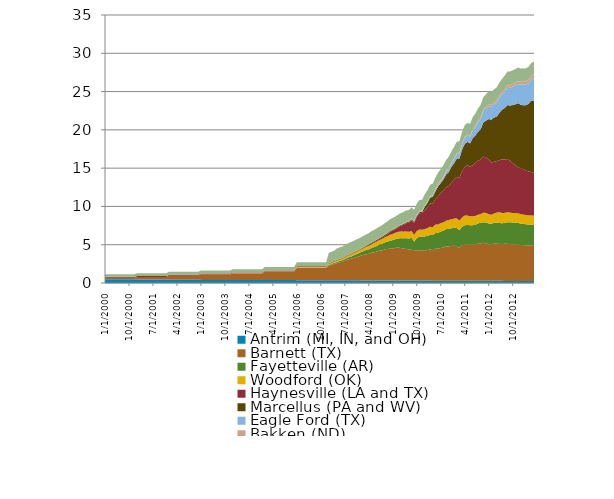
| Category | Antrim (MI, IN, and OH) | Barnett (TX) | Fayetteville (AR) | Woodford (OK) | Haynesville (LA and TX) | Marcellus (PA and WV) | Eagle Ford (TX) | Bakken (ND) | Rest of US |
|---|---|---|---|---|---|---|---|---|---|
| 1/1/00 | 0.481 | 0.184 | 0 | 0.009 | 0.128 | 0.001 | 0 | 0.005 | 0.332 |
| 2/1/00 | 0.481 | 0.184 | 0 | 0.009 | 0.128 | 0.001 | 0 | 0.005 | 0.332 |
| 3/1/00 | 0.481 | 0.184 | 0 | 0.009 | 0.128 | 0.001 | 0 | 0.005 | 0.332 |
| 4/1/00 | 0.481 | 0.184 | 0 | 0.009 | 0.128 | 0.001 | 0 | 0.005 | 0.332 |
| 5/1/00 | 0.481 | 0.184 | 0 | 0.009 | 0.128 | 0.001 | 0 | 0.005 | 0.332 |
| 6/1/00 | 0.481 | 0.184 | 0 | 0.009 | 0.128 | 0.001 | 0 | 0.005 | 0.332 |
| 7/1/00 | 0.481 | 0.184 | 0 | 0.009 | 0.128 | 0.001 | 0 | 0.005 | 0.332 |
| 8/1/00 | 0.481 | 0.184 | 0 | 0.009 | 0.128 | 0.001 | 0 | 0.005 | 0.332 |
| 9/1/00 | 0.481 | 0.184 | 0 | 0.009 | 0.128 | 0.001 | 0 | 0.005 | 0.332 |
| 10/1/00 | 0.481 | 0.184 | 0 | 0.009 | 0.128 | 0.001 | 0 | 0.005 | 0.332 |
| 11/1/00 | 0.481 | 0.184 | 0 | 0.009 | 0.128 | 0.001 | 0 | 0.005 | 0.332 |
| 12/1/00 | 0.481 | 0.184 | 0 | 0.009 | 0.128 | 0.001 | 0 | 0.005 | 0.332 |
| 1/1/01 | 0.461 | 0.314 | 0 | 0.009 | 0.125 | 0.001 | 0 | 0.005 | 0.359 |
| 2/1/01 | 0.461 | 0.314 | 0 | 0.009 | 0.125 | 0.001 | 0 | 0.005 | 0.359 |
| 3/1/01 | 0.461 | 0.314 | 0 | 0.009 | 0.125 | 0.001 | 0 | 0.005 | 0.359 |
| 4/1/01 | 0.461 | 0.314 | 0 | 0.009 | 0.125 | 0.001 | 0 | 0.005 | 0.359 |
| 5/1/01 | 0.461 | 0.314 | 0 | 0.009 | 0.125 | 0.001 | 0 | 0.005 | 0.359 |
| 6/1/01 | 0.461 | 0.314 | 0 | 0.009 | 0.125 | 0.001 | 0 | 0.005 | 0.359 |
| 7/1/01 | 0.461 | 0.314 | 0 | 0.009 | 0.125 | 0.001 | 0 | 0.005 | 0.359 |
| 8/1/01 | 0.461 | 0.314 | 0 | 0.009 | 0.125 | 0.001 | 0 | 0.005 | 0.359 |
| 9/1/01 | 0.461 | 0.314 | 0 | 0.009 | 0.125 | 0.001 | 0 | 0.005 | 0.359 |
| 10/1/01 | 0.461 | 0.314 | 0 | 0.009 | 0.125 | 0.001 | 0 | 0.005 | 0.359 |
| 11/1/01 | 0.461 | 0.314 | 0 | 0.009 | 0.125 | 0.001 | 0 | 0.005 | 0.359 |
| 12/1/01 | 0.461 | 0.314 | 0 | 0.009 | 0.125 | 0.001 | 0 | 0.005 | 0.359 |
| 1/1/02 | 0.438 | 0.508 | 0 | 0.009 | 0.121 | 0 | 0 | 0.004 | 0.39 |
| 2/1/02 | 0.438 | 0.508 | 0 | 0.009 | 0.121 | 0 | 0 | 0.004 | 0.39 |
| 3/1/02 | 0.438 | 0.508 | 0 | 0.009 | 0.121 | 0 | 0 | 0.004 | 0.39 |
| 4/1/02 | 0.438 | 0.508 | 0 | 0.009 | 0.121 | 0 | 0 | 0.004 | 0.39 |
| 5/1/02 | 0.438 | 0.508 | 0 | 0.009 | 0.121 | 0 | 0 | 0.004 | 0.39 |
| 6/1/02 | 0.438 | 0.508 | 0 | 0.009 | 0.121 | 0 | 0 | 0.004 | 0.39 |
| 7/1/02 | 0.438 | 0.508 | 0 | 0.009 | 0.121 | 0 | 0 | 0.004 | 0.39 |
| 8/1/02 | 0.438 | 0.508 | 0 | 0.009 | 0.121 | 0 | 0 | 0.004 | 0.39 |
| 9/1/02 | 0.438 | 0.508 | 0 | 0.009 | 0.121 | 0 | 0 | 0.004 | 0.39 |
| 10/1/02 | 0.438 | 0.508 | 0 | 0.009 | 0.121 | 0 | 0 | 0.004 | 0.39 |
| 11/1/02 | 0.438 | 0.508 | 0 | 0.009 | 0.121 | 0 | 0 | 0.004 | 0.39 |
| 12/1/02 | 0.438 | 0.508 | 0 | 0.009 | 0.121 | 0 | 0 | 0.004 | 0.39 |
| 1/1/03 | 0.405 | 0.706 | 0 | 0.01 | 0.106 | 0 | 0 | 0.004 | 0.414 |
| 2/1/03 | 0.405 | 0.706 | 0 | 0.01 | 0.106 | 0 | 0 | 0.004 | 0.414 |
| 3/1/03 | 0.405 | 0.706 | 0 | 0.01 | 0.106 | 0 | 0 | 0.004 | 0.414 |
| 4/1/03 | 0.405 | 0.706 | 0 | 0.01 | 0.106 | 0 | 0 | 0.004 | 0.414 |
| 5/1/03 | 0.405 | 0.706 | 0 | 0.01 | 0.106 | 0 | 0 | 0.004 | 0.414 |
| 6/1/03 | 0.405 | 0.706 | 0 | 0.01 | 0.106 | 0 | 0 | 0.004 | 0.414 |
| 7/1/03 | 0.405 | 0.706 | 0 | 0.01 | 0.106 | 0 | 0 | 0.004 | 0.414 |
| 8/1/03 | 0.405 | 0.706 | 0 | 0.01 | 0.106 | 0 | 0 | 0.004 | 0.414 |
| 9/1/03 | 0.405 | 0.706 | 0 | 0.01 | 0.106 | 0 | 0 | 0.004 | 0.414 |
| 10/1/03 | 0.405 | 0.706 | 0 | 0.01 | 0.106 | 0 | 0 | 0.004 | 0.414 |
| 11/1/03 | 0.405 | 0.706 | 0 | 0.01 | 0.106 | 0 | 0 | 0.004 | 0.414 |
| 12/1/03 | 0.405 | 0.706 | 0 | 0.01 | 0.106 | 0 | 0 | 0.004 | 0.414 |
| 1/1/04 | 0.391 | 0.857 | 0 | 0.015 | 0.097 | 0 | 0 | 0.004 | 0.437 |
| 2/1/04 | 0.391 | 0.857 | 0 | 0.015 | 0.097 | 0 | 0 | 0.004 | 0.437 |
| 3/1/04 | 0.391 | 0.857 | 0 | 0.015 | 0.097 | 0 | 0 | 0.004 | 0.437 |
| 4/1/04 | 0.391 | 0.857 | 0 | 0.015 | 0.097 | 0 | 0 | 0.004 | 0.437 |
| 5/1/04 | 0.391 | 0.857 | 0 | 0.015 | 0.097 | 0 | 0 | 0.004 | 0.437 |
| 6/1/04 | 0.391 | 0.857 | 0 | 0.015 | 0.097 | 0 | 0 | 0.004 | 0.437 |
| 7/1/04 | 0.391 | 0.857 | 0 | 0.015 | 0.097 | 0 | 0 | 0.004 | 0.437 |
| 8/1/04 | 0.391 | 0.857 | 0 | 0.015 | 0.097 | 0 | 0 | 0.004 | 0.437 |
| 9/1/04 | 0.391 | 0.857 | 0 | 0.015 | 0.097 | 0 | 0 | 0.004 | 0.437 |
| 10/1/04 | 0.391 | 0.857 | 0 | 0.015 | 0.097 | 0 | 0 | 0.004 | 0.437 |
| 11/1/04 | 0.391 | 0.857 | 0 | 0.015 | 0.097 | 0 | 0 | 0.004 | 0.437 |
| 12/1/04 | 0.391 | 0.857 | 0 | 0.015 | 0.097 | 0 | 0 | 0.004 | 0.437 |
| 1/1/05 | 0.381 | 1.134 | 0.006 | 0.025 | 0.091 | 0.002 | 0 | 0.005 | 0.459 |
| 2/1/05 | 0.381 | 1.134 | 0.006 | 0.025 | 0.091 | 0.002 | 0 | 0.005 | 0.459 |
| 3/1/05 | 0.381 | 1.134 | 0.006 | 0.025 | 0.091 | 0.002 | 0 | 0.005 | 0.459 |
| 4/1/05 | 0.381 | 1.134 | 0.006 | 0.025 | 0.091 | 0.002 | 0 | 0.005 | 0.459 |
| 5/1/05 | 0.381 | 1.134 | 0.006 | 0.025 | 0.091 | 0.002 | 0 | 0.005 | 0.459 |
| 6/1/05 | 0.381 | 1.134 | 0.006 | 0.025 | 0.091 | 0.002 | 0 | 0.005 | 0.459 |
| 7/1/05 | 0.381 | 1.134 | 0.006 | 0.025 | 0.091 | 0.002 | 0 | 0.005 | 0.459 |
| 8/1/05 | 0.381 | 1.134 | 0.006 | 0.025 | 0.091 | 0.002 | 0 | 0.005 | 0.459 |
| 9/1/05 | 0.381 | 1.134 | 0.006 | 0.025 | 0.091 | 0.002 | 0 | 0.005 | 0.459 |
| 10/1/05 | 0.381 | 1.134 | 0.006 | 0.025 | 0.091 | 0.002 | 0 | 0.005 | 0.459 |
| 11/1/05 | 0.381 | 1.134 | 0.006 | 0.025 | 0.091 | 0.002 | 0 | 0.005 | 0.459 |
| 12/1/05 | 0.381 | 1.134 | 0.006 | 0.025 | 0.091 | 0.002 | 0 | 0.005 | 0.459 |
| 1/1/06 | 0.373 | 1.61 | 0.04 | 0.071 | 0.082 | 0.012 | 0 | 0.007 | 0.506 |
| 2/1/06 | 0.373 | 1.61 | 0.04 | 0.071 | 0.082 | 0.012 | 0 | 0.007 | 0.506 |
| 3/1/06 | 0.373 | 1.61 | 0.04 | 0.071 | 0.082 | 0.012 | 0 | 0.007 | 0.506 |
| 4/1/06 | 0.373 | 1.61 | 0.04 | 0.071 | 0.082 | 0.012 | 0 | 0.007 | 0.506 |
| 5/1/06 | 0.373 | 1.61 | 0.04 | 0.071 | 0.082 | 0.012 | 0 | 0.007 | 0.506 |
| 6/1/06 | 0.373 | 1.61 | 0.04 | 0.071 | 0.082 | 0.012 | 0 | 0.007 | 0.506 |
| 7/1/06 | 0.373 | 1.61 | 0.04 | 0.071 | 0.082 | 0.012 | 0 | 0.007 | 0.506 |
| 8/1/06 | 0.373 | 1.61 | 0.04 | 0.071 | 0.082 | 0.012 | 0 | 0.007 | 0.506 |
| 9/1/06 | 0.373 | 1.61 | 0.04 | 0.071 | 0.082 | 0.012 | 0 | 0.007 | 0.506 |
| 10/1/06 | 0.373 | 1.61 | 0.04 | 0.071 | 0.082 | 0.012 | 0 | 0.007 | 0.506 |
| 11/1/06 | 0.373 | 1.61 | 0.04 | 0.071 | 0.082 | 0.012 | 0 | 0.007 | 0.506 |
| 12/1/06 | 0.373 | 1.61 | 0.04 | 0.071 | 0.082 | 0.012 | 0 | 0.007 | 0.506 |
| 1/1/07 | 0.362 | 1.921 | 0.099 | 0.131 | 0.081 | 0.02 | 0 | 0.009 | 1.327 |
| 2/1/07 | 0.362 | 1.999 | 0.115 | 0.146 | 0.081 | 0.022 | 0 | 0.009 | 1.327 |
| 3/1/07 | 0.362 | 2.123 | 0.138 | 0.166 | 0.079 | 0.023 | 0 | 0.009 | 1.327 |
| 4/1/07 | 0.363 | 2.208 | 0.157 | 0.176 | 0.077 | 0.024 | 0 | 0.013 | 1.493 |
| 5/1/07 | 0.363 | 2.33 | 0.171 | 0.173 | 0.078 | 0.024 | 0 | 0.013 | 1.493 |
| 6/1/07 | 0.363 | 2.41 | 0.193 | 0.189 | 0.078 | 0.026 | 0 | 0.013 | 1.493 |
| 7/1/07 | 0.36 | 2.523 | 0.227 | 0.21 | 0.077 | 0.026 | 0 | 0.016 | 1.508 |
| 8/1/07 | 0.36 | 2.692 | 0.26 | 0.231 | 0.078 | 0.025 | 0 | 0.016 | 1.508 |
| 9/1/07 | 0.36 | 2.769 | 0.288 | 0.257 | 0.08 | 0.029 | 0 | 0.016 | 1.508 |
| 10/1/07 | 0.358 | 2.869 | 0.329 | 0.283 | 0.081 | 0.031 | 0 | 0.019 | 1.481 |
| 11/1/07 | 0.358 | 2.989 | 0.376 | 0.296 | 0.081 | 0.034 | 0 | 0.019 | 1.481 |
| 12/1/07 | 0.358 | 3.086 | 0.405 | 0.322 | 0.081 | 0.036 | 0 | 0.019 | 1.481 |
| 1/1/08 | 0.338 | 3.24 | 0.436 | 0.352 | 0.085 | 0.036 | 0 | 0.015 | 1.465 |
| 2/1/08 | 0.338 | 3.337 | 0.493 | 0.366 | 0.083 | 0.057 | 0 | 0.015 | 1.465 |
| 3/1/08 | 0.338 | 3.406 | 0.564 | 0.398 | 0.084 | 0.077 | 0 | 0.015 | 1.465 |
| 4/1/08 | 0.337 | 3.468 | 0.598 | 0.443 | 0.096 | 0.09 | 0.001 | 0.022 | 1.469 |
| 5/1/08 | 0.337 | 3.605 | 0.633 | 0.494 | 0.102 | 0.109 | 0.001 | 0.022 | 1.469 |
| 6/1/08 | 0.337 | 3.67 | 0.683 | 0.528 | 0.103 | 0.117 | 0.002 | 0.022 | 1.469 |
| 7/1/08 | 0.339 | 3.758 | 0.737 | 0.569 | 0.115 | 0.136 | 0 | 0.029 | 1.471 |
| 8/1/08 | 0.339 | 3.905 | 0.791 | 0.561 | 0.128 | 0.14 | 0 | 0.029 | 1.471 |
| 9/1/08 | 0.339 | 3.909 | 0.874 | 0.63 | 0.151 | 0.139 | 0.002 | 0.029 | 1.471 |
| 10/1/08 | 0.333 | 4.071 | 0.902 | 0.66 | 0.183 | 0.148 | 0.004 | 0.037 | 1.489 |
| 11/1/08 | 0.333 | 4.118 | 0.952 | 0.712 | 0.247 | 0.149 | 0.004 | 0.037 | 1.489 |
| 12/1/08 | 0.333 | 4.148 | 1.034 | 0.788 | 0.348 | 0.155 | 0.004 | 0.037 | 1.489 |
| 1/1/09 | 0.326 | 4.176 | 1.109 | 0.81 | 0.402 | 0.134 | 0.005 | 0.039 | 1.498 |
| 2/1/09 | 0.326 | 4.269 | 1.131 | 0.839 | 0.488 | 0.096 | 0.008 | 0.039 | 1.498 |
| 3/1/09 | 0.326 | 4.295 | 1.196 | 0.864 | 0.586 | 0.111 | 0.011 | 0.039 | 1.498 |
| 4/1/09 | 0.327 | 4.252 | 1.282 | 0.866 | 0.739 | 0.115 | 0.014 | 0.048 | 1.488 |
| 5/1/09 | 0.327 | 4.172 | 1.343 | 0.862 | 0.885 | 0.121 | 0.018 | 0.048 | 1.488 |
| 6/1/09 | 0.327 | 4.119 | 1.417 | 0.879 | 1.05 | 0.12 | 0.023 | 0.048 | 1.488 |
| 7/1/09 | 0.331 | 4.065 | 1.384 | 0.899 | 1.19 | 0.122 | 0.031 | 0.058 | 1.452 |
| 8/1/09 | 0.331 | 4.001 | 1.59 | 0.874 | 1.397 | 0.131 | 0.041 | 0.058 | 1.452 |
| 9/1/09 | 0.331 | 3.943 | 1.141 | 0.866 | 1.587 | 0.14 | 0.052 | 0.058 | 1.452 |
| 10/1/09 | 0.323 | 3.971 | 1.585 | 0.912 | 1.864 | 0.145 | 0.075 | 0.062 | 1.423 |
| 11/1/09 | 0.323 | 3.955 | 1.773 | 0.932 | 2.129 | 0.144 | 0.108 | 0.062 | 1.423 |
| 12/1/09 | 0.323 | 3.936 | 1.815 | 0.883 | 2.181 | 0.131 | 0.108 | 0.062 | 1.423 |
| 1/1/10 | 0.312 | 3.963 | 1.811 | 0.943 | 2.444 | 0.474 | 0.118 | 0.08 | 1.449 |
| 2/1/10 | 0.312 | 3.992 | 1.841 | 1.025 | 2.654 | 0.628 | 0.126 | 0.08 | 1.449 |
| 3/1/10 | 0.312 | 4.089 | 1.898 | 1.055 | 3.014 | 0.786 | 0.139 | 0.08 | 1.449 |
| 4/1/10 | 0.308 | 3.953 | 2 | 1.022 | 3.11 | 0.858 | 0.156 | 0.101 | 1.474 |
| 5/1/10 | 0.308 | 4.19 | 2.028 | 1.122 | 3.32 | 1.025 | 0.191 | 0.101 | 1.474 |
| 6/1/10 | 0.308 | 4.162 | 2.071 | 1.097 | 3.667 | 1.309 | 0.234 | 0.101 | 1.474 |
| 7/1/10 | 0.308 | 4.271 | 2.142 | 1.1 | 3.94 | 1.279 | 0.246 | 0.122 | 1.46 |
| 8/1/10 | 0.308 | 4.317 | 2.228 | 1.062 | 4.172 | 1.433 | 0.278 | 0.122 | 1.46 |
| 9/1/10 | 0.308 | 4.469 | 2.259 | 1.097 | 4.374 | 1.647 | 0.323 | 0.122 | 1.46 |
| 10/1/10 | 0.305 | 4.481 | 2.284 | 1.165 | 4.429 | 1.822 | 0.36 | 0.139 | 1.483 |
| 11/1/10 | 0.305 | 4.536 | 2.317 | 1.153 | 4.806 | 2.04 | 0.411 | 0.139 | 1.483 |
| 12/1/10 | 0.305 | 4.55 | 2.378 | 1.174 | 5.143 | 2.074 | 0.536 | 0.139 | 1.483 |
| 1/1/11 | 0.299 | 4.514 | 2.373 | 1.26 | 5.425 | 2.376 | 0.597 | 0.123 | 1.475 |
| 2/1/11 | 0.299 | 4.255 | 2.345 | 1.237 | 5.602 | 2.534 | 0.645 | 0.123 | 1.475 |
| 3/1/11 | 0.299 | 4.643 | 2.412 | 1.202 | 6.08 | 2.777 | 0.722 | 0.123 | 1.475 |
| 4/1/11 | 0.292 | 4.712 | 2.529 | 1.286 | 6.335 | 3.014 | 0.776 | 0.137 | 1.523 |
| 5/1/11 | 0.292 | 4.772 | 2.532 | 1.222 | 6.552 | 3.059 | 0.843 | 0.137 | 1.523 |
| 6/1/11 | 0.292 | 4.709 | 2.536 | 1.169 | 6.469 | 3.059 | 0.882 | 0.137 | 1.523 |
| 7/1/11 | 0.295 | 4.689 | 2.565 | 1.162 | 6.646 | 3.57 | 0.97 | 0.182 | 1.59 |
| 8/1/11 | 0.295 | 4.728 | 2.565 | 1.179 | 6.905 | 3.591 | 1.093 | 0.182 | 1.59 |
| 9/1/11 | 0.295 | 4.838 | 2.661 | 1.125 | 7.049 | 3.788 | 1.254 | 0.182 | 1.59 |
| 10/1/11 | 0.291 | 4.878 | 2.696 | 1.146 | 7.115 | 3.98 | 1.341 | 0.22 | 1.635 |
| 11/1/11 | 0.291 | 4.971 | 2.682 | 1.244 | 7.312 | 4.471 | 1.479 | 0.22 | 1.635 |
| 12/1/11 | 0.291 | 4.894 | 2.702 | 1.263 | 7.229 | 4.833 | 1.586 | 0.22 | 1.635 |
| 1/1/12 | 0.284 | 4.79 | 2.71 | 1.202 | 7.183 | 5.243 | 1.654 | 0.256 | 1.705 |
| 2/1/12 | 0.284 | 4.749 | 2.685 | 1.193 | 6.812 | 5.603 | 1.67 | 0.256 | 1.705 |
| 3/1/12 | 0.284 | 4.876 | 2.722 | 1.195 | 6.76 | 5.77 | 1.723 | 0.256 | 1.705 |
| 4/1/12 | 0.279 | 4.831 | 2.756 | 1.335 | 6.719 | 5.81 | 1.816 | 0.3 | 1.699 |
| 5/1/12 | 0.279 | 4.835 | 2.734 | 1.399 | 6.796 | 6.182 | 1.947 | 0.3 | 1.699 |
| 6/1/12 | 0.279 | 4.777 | 2.737 | 1.355 | 6.992 | 6.487 | 2.031 | 0.3 | 1.699 |
| 7/1/12 | 0.275 | 4.863 | 2.733 | 1.289 | 6.951 | 6.731 | 2.107 | 0.341 | 1.799 |
| 8/1/12 | 0.275 | 4.832 | 2.818 | 1.321 | 6.959 | 7.023 | 2.241 | 0.341 | 1.799 |
| 9/1/12 | 0.275 | 4.823 | 2.846 | 1.244 | 6.775 | 7.213 | 2.315 | 0.341 | 1.799 |
| 10/1/12 | 0.273 | 4.765 | 2.855 | 1.254 | 6.506 | 7.579 | 2.415 | 0.362 | 1.766 |
| 11/1/12 | 0.273 | 4.726 | 2.876 | 1.248 | 6.252 | 7.958 | 2.48 | 0.362 | 1.766 |
| 12/1/12 | 0.273 | 4.713 | 2.865 | 1.238 | 6.019 | 8.385 | 2.517 | 0.362 | 1.766 |
| 1/1/13 | 0.268 | 4.698 | 2.809 | 1.229 | 5.996 | 8.283 | 2.598 | 0.41 | 1.72 |
| 2/1/13 | 0.268 | 4.676 | 2.767 | 1.22 | 5.914 | 8.363 | 2.672 | 0.41 | 1.72 |
| 3/1/13 | 0.268 | 4.661 | 2.745 | 1.209 | 5.809 | 8.534 | 2.683 | 0.41 | 1.72 |
| 4/1/13 | 0.265 | 4.633 | 2.737 | 1.198 | 5.729 | 8.841 | 2.718 | 0.461 | 1.679 |
| 5/1/13 | 0.265 | 4.616 | 2.742 | 1.194 | 5.682 | 9.348 | 2.748 | 0.461 | 1.679 |
| 6/1/13 | 0.265 | 4.602 | 2.747 | 1.184 | 5.627 | 9.322 | 3.026 | 0.461 | 1.679 |